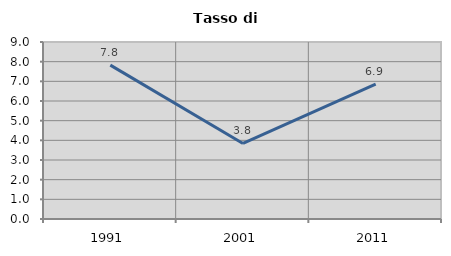
| Category | Tasso di disoccupazione   |
|---|---|
| 1991.0 | 7.823 |
| 2001.0 | 3.842 |
| 2011.0 | 6.86 |